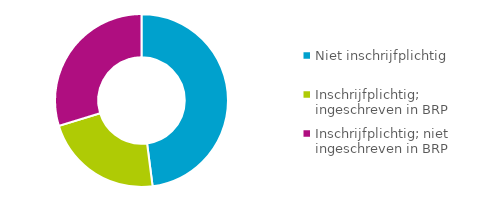
| Category | Aantal |
|---|---|
| Niet inschrijfplichtig | 935 |
| Inschrijfplichtig; ingeschreven in BRP | 435 |
| Inschrijfplichtig; niet ingeschreven in BRP | 580 |